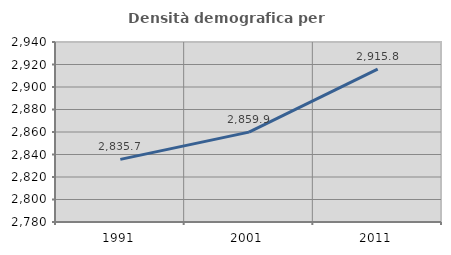
| Category | Densità demografica |
|---|---|
| 1991.0 | 2835.682 |
| 2001.0 | 2859.907 |
| 2011.0 | 2915.822 |